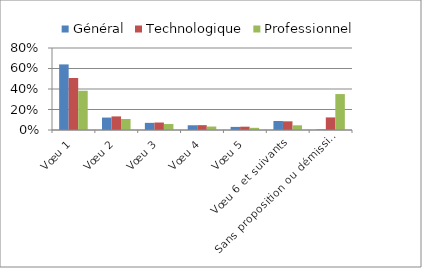
| Category | Général | Technologique | Professionnel |
|---|---|---|---|
| Vœu 1 | 0.64 | 0.507 | 0.383 |
| Vœu 2 | 0.121 | 0.133 | 0.107 |
| Vœu 3 | 0.07 | 0.073 | 0.058 |
| Vœu 4 | 0.046 | 0.047 | 0.034 |
| Vœu 5 | 0.03 | 0.032 | 0.021 |
| Vœu 6 et suivants | 0.088 | 0.085 | 0.046 |
| Sans proposition ou démission | 0.005 | 0.123 | 0.351 |